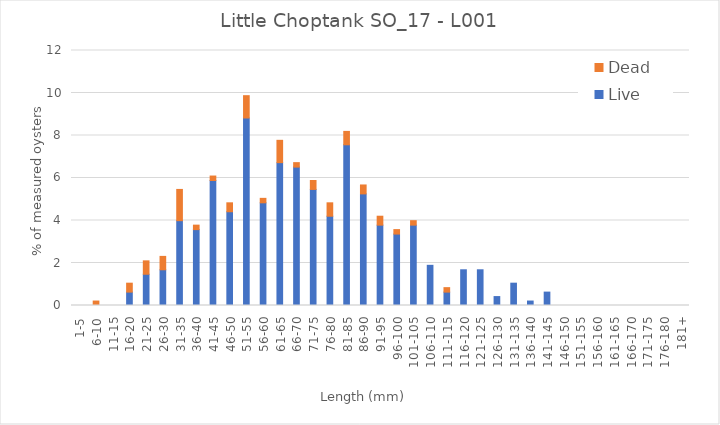
| Category | Live | Dead |
|---|---|---|
| 1-5 | 0 | 0 |
| 6-10 | 0 | 0.21 |
| 11-15 | 0 | 0 |
| 16-20 | 0.63 | 0.42 |
| 21-25 | 1.471 | 0.63 |
| 26-30 | 1.681 | 0.63 |
| 31-35 | 3.992 | 1.471 |
| 36-40 | 3.571 | 0.21 |
| 41-45 | 5.882 | 0.21 |
| 46-50 | 4.412 | 0.42 |
| 51-55 | 8.824 | 1.05 |
| 56-60 | 4.832 | 0.21 |
| 61-65 | 6.723 | 1.05 |
| 66-70 | 6.513 | 0.21 |
| 71-75 | 5.462 | 0.42 |
| 76-80 | 4.202 | 0.63 |
| 81-85 | 7.563 | 0.63 |
| 86-90 | 5.252 | 0.42 |
| 91-95 | 3.782 | 0.42 |
| 96-100 | 3.361 | 0.21 |
| 101-105 | 3.782 | 0.21 |
| 106-110 | 1.891 | 0 |
| 111-115 | 0.63 | 0.21 |
| 116-120 | 1.681 | 0 |
| 121-125 | 1.681 | 0 |
| 126-130 | 0.42 | 0 |
| 131-135 | 1.05 | 0 |
| 136-140 | 0.21 | 0 |
| 141-145 | 0.63 | 0 |
| 146-150 | 0 | 0 |
| 151-155 | 0 | 0 |
| 156-160 | 0 | 0 |
| 161-165 | 0 | 0 |
| 166-170 | 0 | 0 |
| 171-175 | 0 | 0 |
| 176-180 | 0 | 0 |
| 181+ | 0 | 0 |